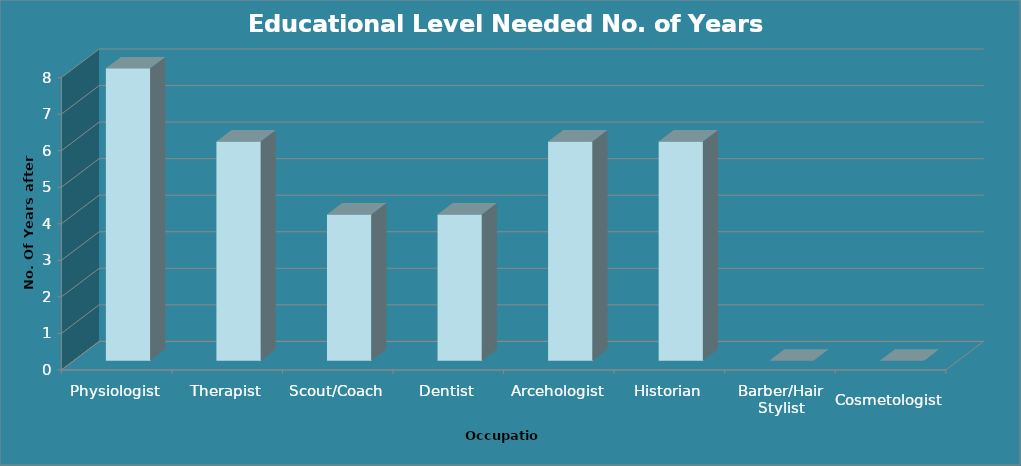
| Category | Educational Level Needed No. of Years after H.S. |
|---|---|
| Physiologist | 8 |
| Therapist | 6 |
| Scout/Coach | 4 |
| Dentist | 4 |
| Arcehologist | 6 |
| Historian | 6 |
| Barber/Hair Stylist | 0 |
| Cosmetologist | 0 |